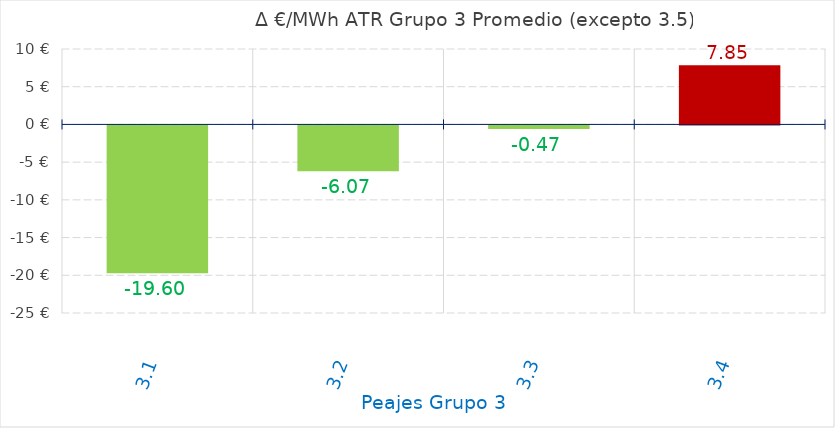
| Category | D €/MWh |
|---|---|
| 3.1 | -19.596 |
| 3.2 | -6.069 |
| 3.3 | -0.474 |
| 3.4 | 7.85 |